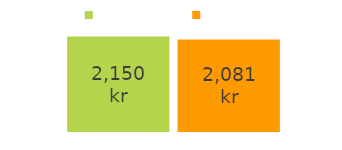
| Category | kommer in | går ut |
|---|---|---|
| pengar som kommer in: | 2150 | 2081 |